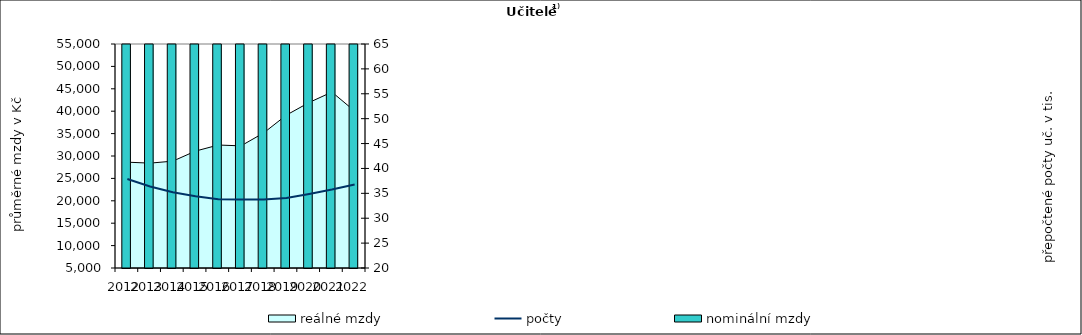
| Category | nominální mzdy |
|---|---|
| 2012.0 | 28020.274 |
| 2013.0 | 28209.183 |
| 2014.0 | 28767.86 |
| 2015.0 | 31100.885 |
| 2016.0 | 32677.579 |
| 2017.0 | 33267.032 |
| 2018.0 | 37023.228 |
| 2019.0 | 42389.097 |
| 2020.0 | 46897.308 |
| 2021.0 | 50958.732 |
| 2022.0 | 52117.215 |